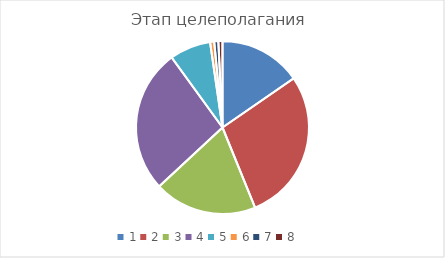
| Category | Series 0 |
|---|---|
| 0 | 0.16 |
| 1 | 0.296 |
| 2 | 0.2 |
| 3 | 0.28 |
| 4 | 0.08 |
| 5 | 0.008 |
| 6 | 0.008 |
| 7 | 0.008 |